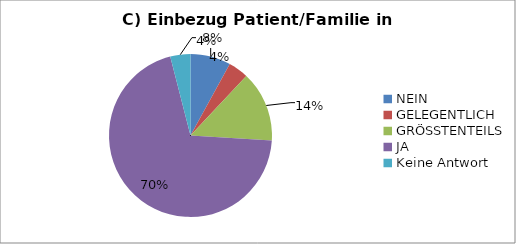
| Category | Series 0 |
|---|---|
| NEIN | 4 |
| GELEGENTLICH | 2 |
| GRÖSSTENTEILS | 7 |
| JA | 35 |
| Keine Antwort | 2 |